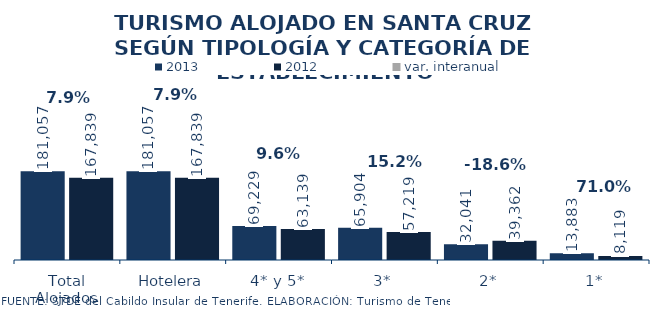
| Category | 2013 | 2012 |
|---|---|---|
| Total Alojados | 181057 | 167839 |
| Hotelera | 181057 | 167839 |
| 4* y 5* | 69229 | 63139 |
| 3* | 65904 | 57219 |
| 2* | 32041 | 39362 |
| 1* | 13883 | 8119 |